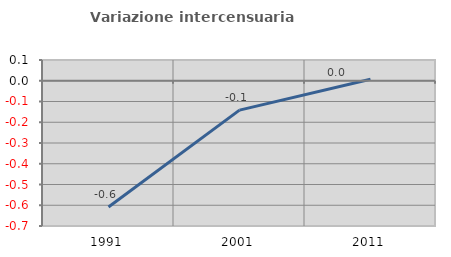
| Category | Variazione intercensuaria annua |
|---|---|
| 1991.0 | -0.608 |
| 2001.0 | -0.142 |
| 2011.0 | 0.008 |